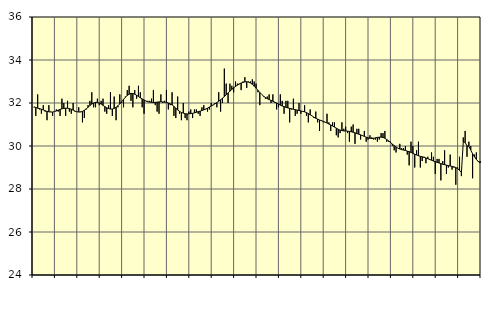
| Category | Piggar | Series 1 |
|---|---|---|
| nan | 31.8 | 31.82 |
| 1.0 | 31.4 | 31.79 |
| 1.0 | 32.4 | 31.76 |
| 1.0 | 31.7 | 31.74 |
| 1.0 | 31.5 | 31.71 |
| 1.0 | 31.9 | 31.68 |
| 1.0 | 31.6 | 31.64 |
| 1.0 | 31.2 | 31.61 |
| 1.0 | 31.9 | 31.59 |
| 1.0 | 31.6 | 31.58 |
| 1.0 | 31.4 | 31.58 |
| 1.0 | 31.6 | 31.6 |
| nan | 31.7 | 31.63 |
| 2.0 | 31.6 | 31.67 |
| 2.0 | 31.4 | 31.7 |
| 2.0 | 32.2 | 31.73 |
| 2.0 | 32 | 31.75 |
| 2.0 | 31.4 | 31.76 |
| 2.0 | 32.1 | 31.76 |
| 2.0 | 31.6 | 31.74 |
| 2.0 | 31.5 | 31.71 |
| 2.0 | 32 | 31.67 |
| 2.0 | 31.6 | 31.62 |
| 2.0 | 31.6 | 31.59 |
| nan | 31.8 | 31.58 |
| 3.0 | 31.6 | 31.58 |
| 3.0 | 31.1 | 31.61 |
| 3.0 | 31.3 | 31.66 |
| 3.0 | 31.7 | 31.73 |
| 3.0 | 31.9 | 31.8 |
| 3.0 | 32.1 | 31.88 |
| 3.0 | 32.5 | 31.95 |
| 3.0 | 31.8 | 32 |
| 3.0 | 31.8 | 32.03 |
| 3.0 | 32.2 | 32.03 |
| 3.0 | 31.9 | 32 |
| nan | 32.1 | 31.95 |
| 4.0 | 32.2 | 31.89 |
| 4.0 | 31.6 | 31.83 |
| 4.0 | 31.5 | 31.78 |
| 4.0 | 31.9 | 31.74 |
| 4.0 | 32.5 | 31.72 |
| 4.0 | 31.4 | 31.72 |
| 4.0 | 32.3 | 31.75 |
| 4.0 | 31.2 | 31.8 |
| 4.0 | 31.8 | 31.87 |
| 4.0 | 32.4 | 31.96 |
| 4.0 | 32 | 32.06 |
| nan | 31.8 | 32.17 |
| 5.0 | 32.3 | 32.27 |
| 5.0 | 32.6 | 32.35 |
| 5.0 | 32.8 | 32.41 |
| 5.0 | 32.1 | 32.45 |
| 5.0 | 31.8 | 32.44 |
| 5.0 | 32.6 | 32.41 |
| 5.0 | 32.2 | 32.36 |
| 5.0 | 32.8 | 32.3 |
| 5.0 | 32.5 | 32.24 |
| 5.0 | 31.8 | 32.19 |
| 5.0 | 31.5 | 32.14 |
| nan | 32.1 | 32.09 |
| 6.0 | 32.1 | 32.06 |
| 6.0 | 32.1 | 32.04 |
| 6.0 | 32.2 | 32.03 |
| 6.0 | 32.6 | 32.02 |
| 6.0 | 31.9 | 32.03 |
| 6.0 | 31.6 | 32.04 |
| 6.0 | 31.5 | 32.05 |
| 6.0 | 32.4 | 32.06 |
| 6.0 | 32 | 32.05 |
| 6.0 | 32.1 | 32.04 |
| 6.0 | 32.6 | 32.03 |
| nan | 31.7 | 32 |
| 7.0 | 31.9 | 31.96 |
| 7.0 | 32.5 | 31.91 |
| 7.0 | 31.4 | 31.84 |
| 7.0 | 31.3 | 31.76 |
| 7.0 | 32.3 | 31.68 |
| 7.0 | 31.5 | 31.61 |
| 7.0 | 31.2 | 31.56 |
| 7.0 | 32 | 31.53 |
| 7.0 | 31.3 | 31.5 |
| 7.0 | 31.2 | 31.49 |
| 7.0 | 31.6 | 31.5 |
| nan | 31.7 | 31.51 |
| 8.0 | 31.3 | 31.52 |
| 8.0 | 31.7 | 31.54 |
| 8.0 | 31.7 | 31.57 |
| 8.0 | 31.5 | 31.6 |
| 8.0 | 31.4 | 31.62 |
| 8.0 | 31.8 | 31.65 |
| 8.0 | 31.9 | 31.68 |
| 8.0 | 31.7 | 31.72 |
| 8.0 | 31.6 | 31.76 |
| 8.0 | 31.7 | 31.81 |
| 8.0 | 32 | 31.86 |
| nan | 31.9 | 31.91 |
| 9.0 | 32 | 31.96 |
| 9.0 | 31.8 | 32.02 |
| 9.0 | 32.5 | 32.08 |
| 9.0 | 31.6 | 32.15 |
| 9.0 | 32 | 32.22 |
| 9.0 | 33.6 | 32.3 |
| 9.0 | 32.9 | 32.38 |
| 9.0 | 32 | 32.47 |
| 9.0 | 32.9 | 32.55 |
| 9.0 | 32.8 | 32.63 |
| 9.0 | 32.5 | 32.71 |
| nan | 33 | 32.77 |
| 10.0 | 32.9 | 32.83 |
| 10.0 | 32.9 | 32.88 |
| 10.0 | 32.6 | 32.93 |
| 10.0 | 33 | 32.96 |
| 10.0 | 33.2 | 32.98 |
| 10.0 | 32.7 | 32.99 |
| 10.0 | 33 | 32.97 |
| 10.0 | 33 | 32.93 |
| 10.0 | 33.1 | 32.87 |
| 10.0 | 33 | 32.78 |
| 10.0 | 32.9 | 32.69 |
| nan | 32.5 | 32.59 |
| 11.0 | 31.9 | 32.49 |
| 11.0 | 32.4 | 32.4 |
| 11.0 | 32.3 | 32.32 |
| 11.0 | 32.2 | 32.26 |
| 11.0 | 32.3 | 32.2 |
| 11.0 | 32.4 | 32.16 |
| 11.0 | 32 | 32.12 |
| 11.0 | 32.4 | 32.08 |
| 11.0 | 32 | 32.04 |
| 11.0 | 31.7 | 32 |
| 11.0 | 31.8 | 31.95 |
| nan | 32.4 | 31.9 |
| 12.0 | 32.1 | 31.86 |
| 12.0 | 31.5 | 31.83 |
| 12.0 | 32.1 | 31.8 |
| 12.0 | 32.1 | 31.77 |
| 12.0 | 31.1 | 31.75 |
| 12.0 | 31.7 | 31.73 |
| 12.0 | 32.2 | 31.71 |
| 12.0 | 31.4 | 31.69 |
| 12.0 | 31.5 | 31.67 |
| 12.0 | 32 | 31.65 |
| 12.0 | 31.5 | 31.63 |
| nan | 31.6 | 31.61 |
| 13.0 | 31.9 | 31.59 |
| 13.0 | 31.4 | 31.55 |
| 13.0 | 31.1 | 31.51 |
| 13.0 | 31.7 | 31.45 |
| 13.0 | 31.4 | 31.4 |
| 13.0 | 31.3 | 31.34 |
| 13.0 | 31.6 | 31.29 |
| 13.0 | 31.1 | 31.25 |
| 13.0 | 30.7 | 31.21 |
| 13.0 | 31.2 | 31.18 |
| 13.0 | 31.1 | 31.15 |
| nan | 31.1 | 31.11 |
| 14.0 | 31.5 | 31.07 |
| 14.0 | 31.1 | 31.02 |
| 14.0 | 30.7 | 30.98 |
| 14.0 | 31.1 | 30.93 |
| 14.0 | 31.1 | 30.88 |
| 14.0 | 30.5 | 30.83 |
| 14.0 | 30.4 | 30.78 |
| 14.0 | 30.6 | 30.74 |
| 14.0 | 31.1 | 30.72 |
| 14.0 | 30.8 | 30.7 |
| 14.0 | 30.9 | 30.7 |
| nan | 30.6 | 30.69 |
| 15.0 | 30.2 | 30.68 |
| 15.0 | 30.9 | 30.66 |
| 15.0 | 31 | 30.64 |
| 15.0 | 30.1 | 30.61 |
| 15.0 | 30.8 | 30.58 |
| 15.0 | 30.8 | 30.55 |
| 15.0 | 30.3 | 30.52 |
| 15.0 | 30.5 | 30.48 |
| 15.0 | 30.7 | 30.45 |
| 15.0 | 30.2 | 30.41 |
| 15.0 | 30.3 | 30.38 |
| nan | 30.5 | 30.36 |
| 16.0 | 30.4 | 30.35 |
| 16.0 | 30.3 | 30.36 |
| 16.0 | 30.3 | 30.38 |
| 16.0 | 30.2 | 30.4 |
| 16.0 | 30.3 | 30.41 |
| 16.0 | 30.6 | 30.41 |
| 16.0 | 30.6 | 30.4 |
| 16.0 | 30.7 | 30.36 |
| 16.0 | 30.2 | 30.3 |
| 16.0 | 30.2 | 30.24 |
| 16.0 | 30.2 | 30.17 |
| nan | 30 | 30.09 |
| 17.0 | 29.8 | 30.02 |
| 17.0 | 29.7 | 29.95 |
| 17.0 | 29.9 | 29.9 |
| 17.0 | 30.1 | 29.86 |
| 17.0 | 29.9 | 29.83 |
| 17.0 | 29.9 | 29.81 |
| 17.0 | 30 | 29.79 |
| 17.0 | 29.6 | 29.76 |
| 17.0 | 29.1 | 29.74 |
| 17.0 | 30.2 | 29.7 |
| 17.0 | 30 | 29.66 |
| nan | 29 | 29.62 |
| 18.0 | 29.8 | 29.58 |
| 18.0 | 30.2 | 29.55 |
| 18.0 | 29 | 29.52 |
| 18.0 | 29.3 | 29.5 |
| 18.0 | 29.5 | 29.47 |
| 18.0 | 29.2 | 29.44 |
| 18.0 | 29.5 | 29.41 |
| 18.0 | 29.4 | 29.37 |
| 18.0 | 29.7 | 29.34 |
| 18.0 | 29.5 | 29.3 |
| 18.0 | 28.7 | 29.27 |
| nan | 29.4 | 29.24 |
| 19.0 | 29.4 | 29.21 |
| 19.0 | 28.4 | 29.18 |
| 19.0 | 29.3 | 29.15 |
| 19.0 | 29.8 | 29.13 |
| 19.0 | 28.7 | 29.11 |
| 19.0 | 29 | 29.09 |
| 19.0 | 29.6 | 29.07 |
| 19.0 | 28.9 | 29.05 |
| 19.0 | 29 | 29.03 |
| 19.0 | 28.2 | 29 |
| 19.0 | 29 | 28.94 |
| nan | 29.5 | 28.87 |
| 20.0 | 28.6 | 28.76 |
| 20.0 | 30.4 | 30.18 |
| 20.0 | 30.7 | 30.17 |
| 20.0 | 29.5 | 30 |
| 20.0 | 30.2 | 29.98 |
| 20.0 | 30 | 29.81 |
| 20.0 | 28.5 | 29.64 |
| 20.0 | 29.6 | 29.5 |
| 20.0 | 29.7 | 29.38 |
| 20.0 | 29.3 | 29.28 |
| 20.0 | 29.3 | 29.21 |